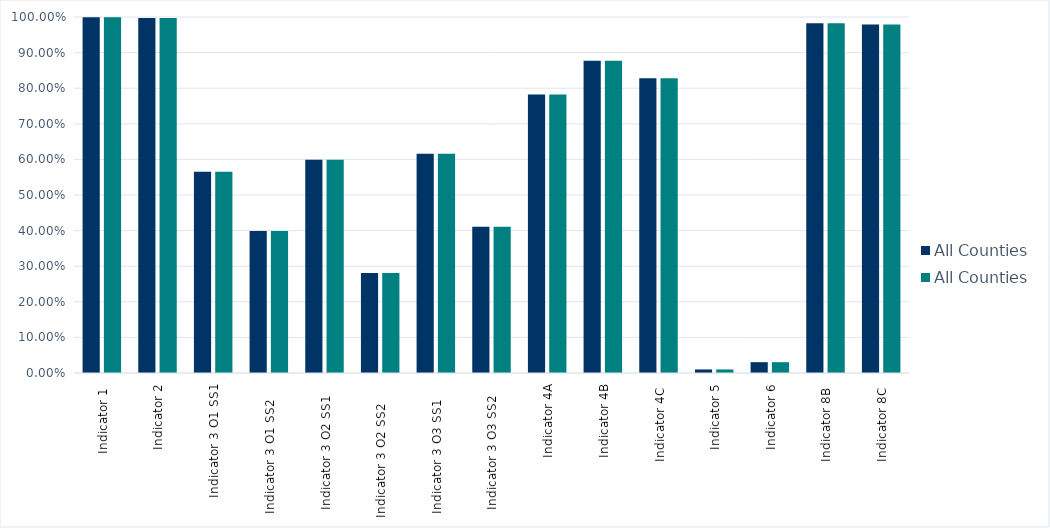
| Category | All Counties |
|---|---|
| Indicator 1  | 0.999 |
| Indicator 2 | 0.997 |
| Indicator 3 O1 SS1 | 0.565 |
| Indicator 3 O1 SS2     | 0.399 |
| Indicator 3 O2 SS1    | 0.599 |
| Indicator 3 O2 SS2      | 0.281 |
| Indicator 3 O3 SS1     | 0.616 |
| Indicator 3 O3 SS2    | 0.411 |
| Indicator 4A | 0.782 |
| Indicator 4B | 0.877 |
| Indicator 4C  | 0.828 |
| Indicator 5 | 0.01 |
| Indicator 6 | 0.03 |
| Indicator 8B  | 0.983 |
| Indicator 8C  | 0.979 |